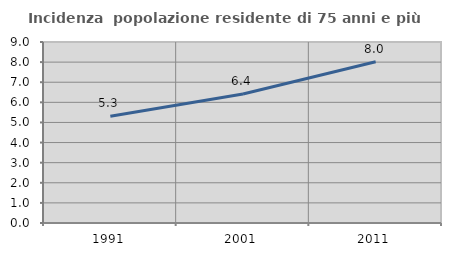
| Category | Incidenza  popolazione residente di 75 anni e più |
|---|---|
| 1991.0 | 5.309 |
| 2001.0 | 6.411 |
| 2011.0 | 8.021 |